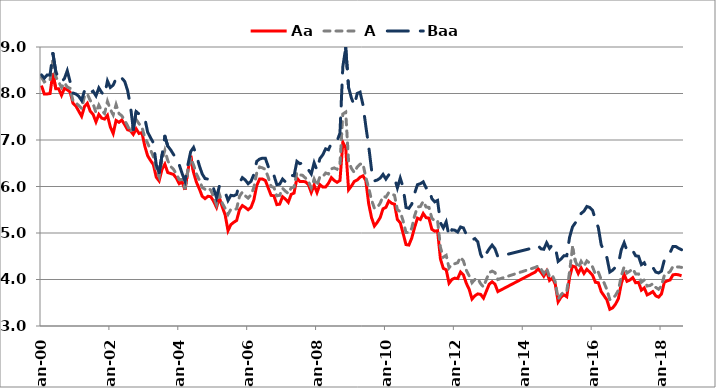
| Category | Aa | A | Baa |
|---|---|---|---|
| 2000-01-01 | 8.17 | 8.35 | 8.4 |
| 2000-02-01 | 7.99 | 8.25 | 8.33 |
| 2000-03-01 | 7.99 | 8.28 | 8.4 |
| 2000-04-01 | 8 | 8.29 | 8.4 |
| 2000-05-01 | 8.44 | 8.7 | 8.86 |
| 2000-06-01 | 8.1 | 8.36 | 8.47 |
| 2000-07-01 | 8.1 | 8.25 | 8.33 |
| 2000-08-01 | 7.96 | 8.13 | 8.25 |
| 2000-09-01 | 8.11 | 8.23 | 8.32 |
| 2000-10-01 | 8.08 | 8.14 | 8.49 |
| 2000-11-01 | 8.03 | 8.11 | 8.25 |
| 2000-12-01 | 7.79 | 7.84 | 8.01 |
| 2001-01-01 | 7.73 | 7.8 | 7.99 |
| 2001-02-01 | 7.62 | 7.74 | 7.94 |
| 2001-03-01 | 7.51 | 7.68 | 7.85 |
| 2001-04-01 | 7.72 | 7.94 | 8.06 |
| 2001-05-01 | 7.79 | 7.99 | 8.11 |
| 2001-06-01 | 7.62 | 7.85 | 8.02 |
| 2001-07-01 | 7.55 | 7.78 | 8.05 |
| 2001-08-01 | 7.39 | 7.59 | 7.95 |
| 2001-09-01 | 7.55 | 7.75 | 8.12 |
| 2001-10-01 | 7.47 | 7.63 | 8.02 |
| 2001-11-01 | 7.45 | 7.57 | 7.96 |
| 2001-12-01 | 7.53 | 7.83 | 8.27 |
| 2002-01-01 | 7.28 | 7.66 | 8.13 |
| 2002-02-01 | 7.14 | 7.54 | 8.18 |
| 2002-03-01 | 7.42 | 7.76 | 8.32 |
| 2002-04-01 | 7.38 | 7.57 | 8.26 |
| 2002-05-01 | 7.43 | 7.52 | 8.33 |
| 2002-06-01 | 7.33 | 7.42 | 8.26 |
| 2002-07-01 | 7.22 | 7.31 | 8.07 |
| 2002-08-01 | 7.2 | 7.17 | 7.74 |
| 2002-09-01 | 7.12 | 7.32 | 7.23 |
| 2002-10-01 | 7.24 | 7.44 | 7.61 |
| 2002-11-01 | 7.14 | 7.35 | 7.56 |
| 2002-12-01 | 7.16 | 7.28 | 7.52 |
| 2003-01-01 | 6.87 | 7.06 | 7.47 |
| 2003-02-01 | 6.66 | 6.93 | 7.17 |
| 2003-03-01 | 6.56 | 6.79 | 7.05 |
| 2003-04-01 | 6.47 | 6.64 | 6.94 |
| 2003-05-01 | 6.2 | 6.36 | 6.47 |
| 2003-06-01 | 6.12 | 6.21 | 6.3 |
| 2003-07-01 | 6.37 | 6.57 | 6.67 |
| 2003-08-01 | 6.48 | 6.78 | 7.08 |
| 2003-09-01 | 6.3 | 6.56 | 6.87 |
| 2003-10-01 | 6.28 | 6.43 | 6.79 |
| 2003-11-01 | 6.26 | 6.37 | 6.69 |
| 2003-12-01 | 6.18 | 6.27 | 6.61 |
| 2004-01-01 | 6.06 | 6.15 | 6.47 |
| 2004-02-01 | 6.1 | 6.15 | 6.28 |
| 2004-03-01 | 5.93 | 5.97 | 6.12 |
| 2004-04-01 | 6.33 | 6.35 | 6.46 |
| 2004-05-01 | 6.66 | 6.62 | 6.75 |
| 2004-06-01 | 6.3 | 6.46 | 6.84 |
| 2004-07-01 | 6.09 | 6.27 | 6.67 |
| 2004-08-01 | 5.95 | 6.14 | 6.45 |
| 2004-09-01 | 5.79 | 5.98 | 6.27 |
| 2004-10-01 | 5.74 | 5.94 | 6.17 |
| 2004-11-01 | 5.79 | 5.97 | 6.16 |
| 2004-12-01 | 5.78 | 5.92 | 6.1 |
| 2005-01-01 | 5.68 | 5.78 | 5.95 |
| 2005-02-01 | 5.55 | 5.61 | 5.76 |
| 2005-03-01 | 5.76 | 5.83 | 6.01 |
| 2005-04-01 | 5.56 | 5.64 | 5.95 |
| 2005-05-01 | 5.39 | 5.53 | 5.88 |
| 2005-06-01 | 5.05 | 5.4 | 5.7 |
| 2005-07-01 | 5.18 | 5.51 | 5.81 |
| 2005-08-01 | 5.23 | 5.5 | 5.8 |
| 2005-09-01 | 5.27 | 5.52 | 5.83 |
| 2005-10-01 | 5.5 | 5.79 | 6.08 |
| 2005-11-01 | 5.59 | 5.88 | 6.19 |
| 2005-12-01 | 5.55 | 5.8 | 6.14 |
| 2006-01-01 | 5.5 | 5.75 | 6.06 |
| 2006-02-01 | 5.55 | 5.82 | 6.11 |
| 2006-03-01 | 5.71 | 5.98 | 6.26 |
| 2006-04-01 | 6.02 | 6.29 | 6.54 |
| 2006-05-01 | 6.16 | 6.42 | 6.59 |
| 2006-06-01 | 6.16 | 6.4 | 6.61 |
| 2006-07-01 | 6.13 | 6.37 | 6.61 |
| 2006-08-01 | 5.97 | 6.2 | 6.43 |
| 2006-09-01 | 5.81 | 6 | 6.26 |
| 2006-10-01 | 5.8 | 5.98 | 6.24 |
| 2006-11-01 | 5.61 | 5.8 | 6.04 |
| 2006-12-01 | 5.62 | 5.81 | 6.05 |
| 2007-01-01 | 5.78 | 5.96 | 6.16 |
| 2007-02-01 | 5.73 | 5.9 | 6.1 |
| 2007-03-01 | 5.66 | 5.85 | 6.1 |
| 2007-04-01 | 5.83 | 5.97 | 6.24 |
| 2007-05-01 | 5.86 | 5.99 | 6.23 |
| 2007-06-01 | 6.18 | 6.3 | 6.54 |
| 2007-07-01 | 6.11 | 6.25 | 6.49 |
| 2007-08-01 | 6.11 | 6.24 | 6.51 |
| 2007-09-01 | 6.1 | 6.18 | 6.45 |
| 2007-10-01 | 6.04 | 6.11 | 6.36 |
| 2007-11-01 | 5.87 | 5.97 | 6.27 |
| 2007-12-01 | 6.03 | 6.16 | 6.51 |
| 2008-01-01 | 5.87 | 6.02 | 6.35 |
| 2008-02-01 | 6.04 | 6.21 | 6.6 |
| 2008-03-01 | 5.99 | 6.21 | 6.68 |
| 2008-04-01 | 5.99 | 6.29 | 6.81 |
| 2008-05-01 | 6.07 | 6.27 | 6.79 |
| 2008-06-01 | 6.19 | 6.38 | 6.93 |
| 2008-07-01 | 6.13 | 6.4 | 6.97 |
| 2008-08-01 | 6.09 | 6.37 | 6.98 |
| 2008-09-01 | 6.13 | 6.49 | 7.15 |
| 2008-10-01 | 6.95 | 7.56 | 8.58 |
| 2008-11-01 | 6.83 | 7.6 | 8.98 |
| 2008-12-01 | 5.93 | 6.54 | 8.13 |
| 2009-01-01 | 6.01 | 6.39 | 7.9 |
| 2009-02-01 | 6.11 | 6.3 | 7.74 |
| 2009-03-01 | 6.14 | 6.42 | 8 |
| 2009-04-01 | 6.2 | 6.48 | 8.03 |
| 2009-05-01 | 6.23 | 6.49 | 7.76 |
| 2009-06-01 | 6.13 | 6.2 | 7.3 |
| 2009-07-01 | 5.63 | 5.97 | 6.87 |
| 2009-08-01 | 5.33 | 5.71 | 6.36 |
| 2009-09-01 | 5.15 | 5.53 | 6.12 |
| 2009-10-01 | 5.23 | 5.55 | 6.14 |
| 2009-11-01 | 5.33 | 5.64 | 6.18 |
| 2009-12-01 | 5.52 | 5.79 | 6.26 |
| 2010-01-01 | 5.55 | 5.77 | 6.16 |
| 2010-02-01 | 5.69 | 5.87 | 6.25 |
| 2010-03-01 | 5.64 | 5.84 | 6.22 |
| 2010-04-01 | 5.62 | 5.81 | 6.19 |
| 2010-05-01 | 5.29 | 5.5 | 5.97 |
| 2010-06-01 | 5.22 | 5.46 | 6.18 |
| 2010-07-01 | 4.99 | 5.26 | 5.98 |
| 2010-08-01 | 4.75 | 5.01 | 5.55 |
| 2010-09-01 | 4.74 | 5.01 | 5.53 |
| 2010-10-01 | 4.89 | 5.1 | 5.62 |
| 2010-11-01 | 5.12 | 5.37 | 5.85 |
| 2010-12-01 | 5.32 | 5.56 | 6.04 |
| 2011-01-01 | 5.29 | 5.57 | 6.06 |
| 2011-02-01 | 5.42 | 5.68 | 6.1 |
| 2011-03-01 | 5.33 | 5.56 | 5.97 |
| 2011-04-01 | 5.32 | 5.55 | 5.98 |
| 2011-05-01 | 5.08 | 5.32 | 5.74 |
| 2011-06-01 | 5.04 | 5.26 | 5.67 |
| 2011-07-01 | 5.05 | 5.27 | 5.7 |
| 2011-08-01 | 4.44 | 4.69 | 5.22 |
| 2011-09-01 | 4.24 | 4.48 | 5.11 |
| 2011-10-01 | 4.21 | 4.52 | 5.24 |
| 2011-11-01 | 3.92 | 4.25 | 4.93 |
| 2011-12-01 | 4 | 4.33 | 5.07 |
| 2012-01-01 | 4.03 | 4.34 | 5.06 |
| 2012-02-01 | 4.02 | 4.36 | 5.02 |
| 2012-03-01 | 4.16 | 4.48 | 5.13 |
| 2012-04-01 | 4.1 | 4.4 | 5.11 |
| 2012-05-01 | 3.92 | 4.2 | 4.97 |
| 2012-06-01 | 3.79 | 4.08 | 4.91 |
| 2012-07-01 | 3.58 | 3.93 | 4.85 |
| 2012-08-01 | 3.65 | 4 | 4.88 |
| 2012-09-01 | 3.69 | 4.02 | 4.81 |
| 2012-10-01 | 3.68 | 3.91 | 4.54 |
| 2012-11-01 | 3.6 | 3.84 | 4.42 |
| 2012-12-01 | 3.75 | 4 | 4.56 |
| 2013-01-01 | 3.9 | 4.15 | 4.66 |
| 2013-02-01 | 3.95 | 4.18 | 4.74 |
| 2013-03-01 | 3.9 | 4.15 | 4.66 |
| 2013-04-01 | 3.74 | 4 | 4.49 |
| 2014-05-01 | 4.16 | 4.26 | 4.69 |
| 2014-06-01 | 4.23 | 4.29 | 4.73 |
| 2014-07-01 | 4.16 | 4.23 | 4.66 |
| 2014-08-01 | 4.07 | 4.13 | 4.65 |
| 2014-09-01 | 4.18 | 4.24 | 4.79 |
| 2014-10-01 | 3.98 | 4.06 | 4.67 |
| 2014-11-01 | 4.03 | 4.09 | 4.75 |
| 2014-12-01 | 3.9 | 3.95 | 4.7 |
| 2015-01-01 | 3.52 | 3.58 | 4.39 |
| 2015-02-01 | 3.62 | 3.67 | 4.44 |
| 2015-03-01 | 3.67 | 3.74 | 4.51 |
| 2015-04-01 | 3.63 | 3.75 | 4.51 |
| 2015-05-01 | 4.05 | 4.17 | 4.91 |
| 2015-06-01 | 4.29 | 4.69 | 5.13 |
| 2015-07-01 | 4.27 | 4.4 | 5.22 |
| 2015-08-01 | 4.13 | 4.25 | 5.23 |
| 2015-09-01 | 4.25 | 4.39 | 5.42 |
| 2015-10-01 | 4.13 | 4.29 | 5.47 |
| 2015-11-01 | 4.22 | 4.4 | 5.57 |
| 2015-12-01 | 4.16 | 4.35 | 5.55 |
| 2016-01-01 | 4.09 | 4.27 | 5.49 |
| 2016-02-01 | 3.94 | 4.11 | 5.28 |
| 2016-03-01 | 3.93 | 4.16 | 5.12 |
| 2016-04-01 | 3.74 | 4 | 4.75 |
| 2016-05-01 | 3.65 | 3.93 | 4.6 |
| 2016-06-01 | 3.56 | 3.78 | 4.47 |
| 2016-07-01 | 3.36 | 3.57 | 4.16 |
| 2016-08-01 | 3.39 | 3.59 | 4.2 |
| 2016-09-01 | 3.47 | 3.66 | 4.27 |
| 2016-10-01 | 3.59 | 3.77 | 4.34 |
| 2016-11-01 | 3.91 | 4.08 | 4.64 |
| 2016-12-01 | 4.11 | 4.27 | 4.79 |
| 2017-01-01 | 3.96 | 4.14 | 4.62 |
| 2017-02-01 | 3.99 | 4.18 | 4.58 |
| 2017-03-01 | 4.04 | 4.23 | 4.62 |
| 2017-04-01 | 3.93 | 4.12 | 4.51 |
| 2017-05-01 | 3.94 | 4.12 | 4.5 |
| 2017-06-01 | 3.77 | 3.94 | 4.32 |
| 2017-07-01 | 3.82 | 3.99 | 4.36 |
| 2017-08-01 | 3.67 | 3.86 | 4.23 |
| 2017-09-01 | 3.7 | 3.87 | 4.24 |
| 2017-10-01 | 3.74 | 3.91 | 4.26 |
| 2017-11-01 | 3.65 | 3.83 | 4.16 |
| 2017-12-01 | 3.62 | 3.79 | 4.14 |
| 2018-01-01 | 3.69 | 3.86 | 4.18 |
| 2018-02-01 | 3.94 | 4.09 | 4.42 |
| 2018-03-01 | 3.97 | 4.13 | 4.52 |
| 2018-04-01 | 3.99 | 4.17 | 4.58 |
| 2018-05-01 | 4.1 | 4.28 | 4.71 |
| 2018-06-01 | 4.11 | 4.27 | 4.71 |
| 2018-07-01 | 4.1 | 4.27 | 4.67 |
| 2018-08-01 | 4.08 | 4.26 | 4.64 |